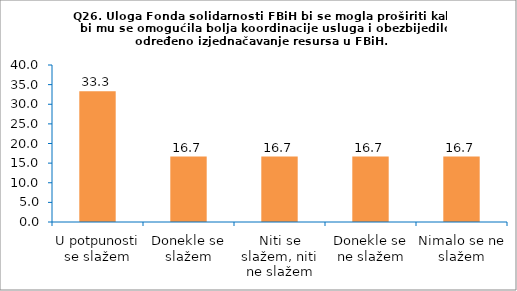
| Category | Series 0 |
|---|---|
| U potpunosti se slažem | 33.333 |
| Donekle se slažem | 16.667 |
| Niti se slažem, niti ne slažem | 16.667 |
| Donekle se ne slažem | 16.667 |
| Nimalo se ne slažem | 16.667 |